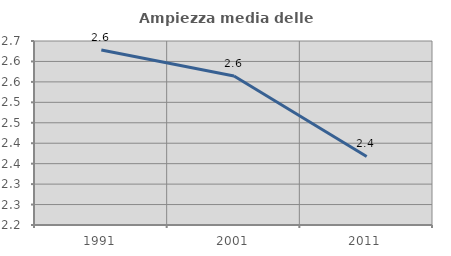
| Category | Ampiezza media delle famiglie |
|---|---|
| 1991.0 | 2.628 |
| 2001.0 | 2.565 |
| 2011.0 | 2.368 |